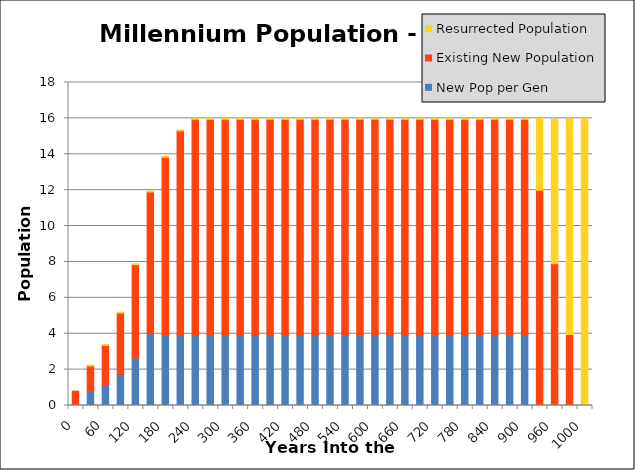
| Category | New Pop per Gen | Existing New Population | Resurrected Population |
|---|---|---|---|
| 0 | 0 | 0.8 | 0 |
| 30 | 0.8 | 1.4 | 0.05 |
| 60 | 1.15 | 2.2 | 0.05 |
| 90 | 1.75 | 3.4 | 0.05 |
| 120 | 2.65 | 5.2 | 0.05 |
| 150 | 4 | 7.9 | 0.05 |
| 180 | 3.95 | 9.875 | 0.05 |
| 210 | 3.95 | 11.356 | 0.05 |
| 240 | 3.95 | 12 | 0.05 |
| 270 | 3.95 | 12 | 0.05 |
| 300 | 3.95 | 12 | 0.05 |
| 330 | 3.95 | 12 | 0.05 |
| 360 | 3.95 | 12 | 0.05 |
| 390 | 3.95 | 12 | 0.05 |
| 420 | 3.95 | 12 | 0.05 |
| 450 | 3.95 | 12 | 0.05 |
| 480 | 3.95 | 12 | 0.05 |
| 510 | 3.95 | 12 | 0.05 |
| 540 | 3.95 | 12 | 0.05 |
| 570 | 3.95 | 12 | 0.05 |
| 600 | 3.95 | 12 | 0.05 |
| 630 | 3.95 | 12 | 0.05 |
| 660 | 3.95 | 12 | 0.05 |
| 690 | 3.95 | 12 | 0.05 |
| 720 | 3.95 | 12 | 0.05 |
| 750 | 3.95 | 12 | 0.05 |
| 780 | 3.95 | 12 | 0.05 |
| 810 | 3.95 | 12 | 0.05 |
| 840 | 3.95 | 12 | 0.05 |
| 870 | 3.95 | 12 | 0.05 |
| 900 | 3.95 | 12 | 0.05 |
| 930 | 0 | 12 | 4 |
| 960 | 0 | 7.9 | 8.07 |
| 990 | 0 | 3.95 | 12.03 |
| 1000 | 0 | 0 | 16 |